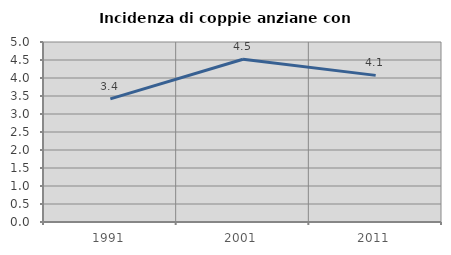
| Category | Incidenza di coppie anziane con figli |
|---|---|
| 1991.0 | 3.421 |
| 2001.0 | 4.519 |
| 2011.0 | 4.073 |